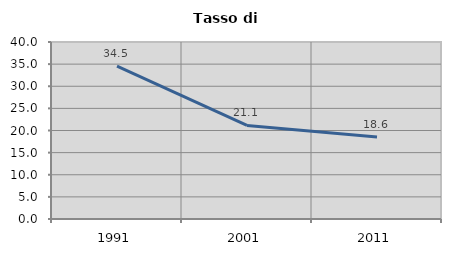
| Category | Tasso di disoccupazione   |
|---|---|
| 1991.0 | 34.537 |
| 2001.0 | 21.148 |
| 2011.0 | 18.557 |